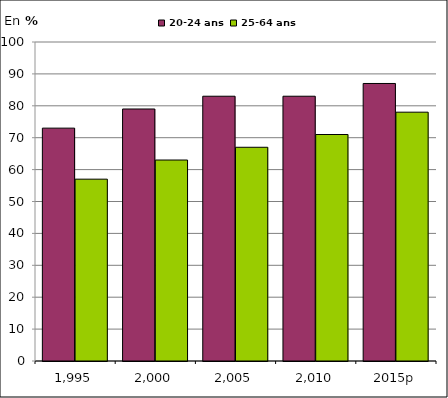
| Category | 20-24 ans | 25-64 ans |
|---|---|---|
| 1 995 | 73 | 57 |
| 2 000 | 79 | 63 |
| 2 005 | 83 | 67 |
| 2 010 | 83 | 71 |
| 2015p | 87 | 78 |